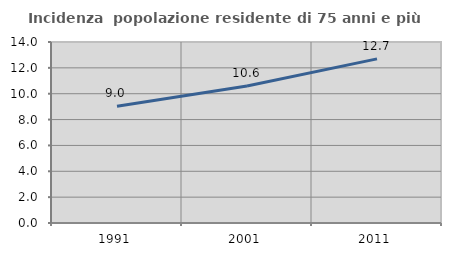
| Category | Incidenza  popolazione residente di 75 anni e più |
|---|---|
| 1991.0 | 9.028 |
| 2001.0 | 10.597 |
| 2011.0 | 12.695 |